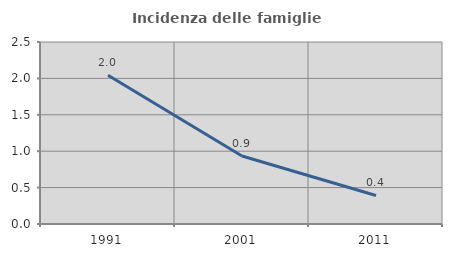
| Category | Incidenza delle famiglie numerose |
|---|---|
| 1991.0 | 2.044 |
| 2001.0 | 0.934 |
| 2011.0 | 0.392 |